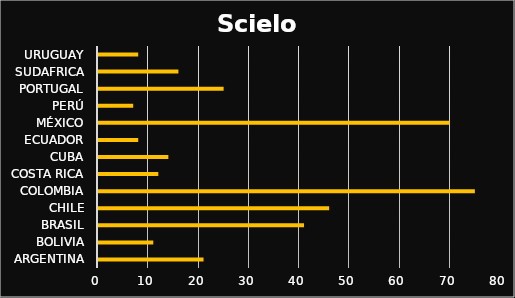
| Category | Series 0 |
|---|---|
| ARGENTINA | 21 |
| BOLIVIA | 11 |
| BRASIL | 41 |
| CHILE | 46 |
| COLOMBIA | 75 |
| COSTA RICA | 12 |
| CUBA | 14 |
| ECUADOR | 8 |
| MÉXICO | 70 |
| PERÚ | 7 |
| PORTUGAL | 25 |
| SUDAFRICA | 16 |
| URUGUAY | 8 |